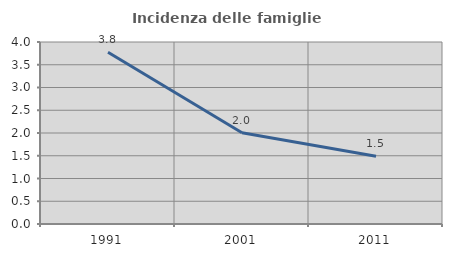
| Category | Incidenza delle famiglie numerose |
|---|---|
| 1991.0 | 3.775 |
| 2001.0 | 2.004 |
| 2011.0 | 1.491 |